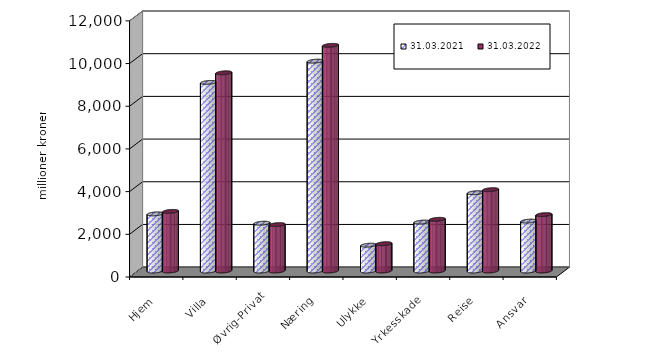
| Category | 31.03.2021 | 31.03.2022 |
|---|---|---|
| Hjem | 2675.988 | 2791.509 |
| Villa | 8834.491 | 9285.057 |
| Øvrig-Privat | 2240.345 | 2173.376 |
| Næring | 9831.62 | 10571.09 |
| Ulykke | 1208.418 | 1277.828 |
| Yrkesskade | 2292.455 | 2420.38 |
| Reise | 3666.629 | 3810.492 |
| Ansvar | 2338.099 | 2641.305 |